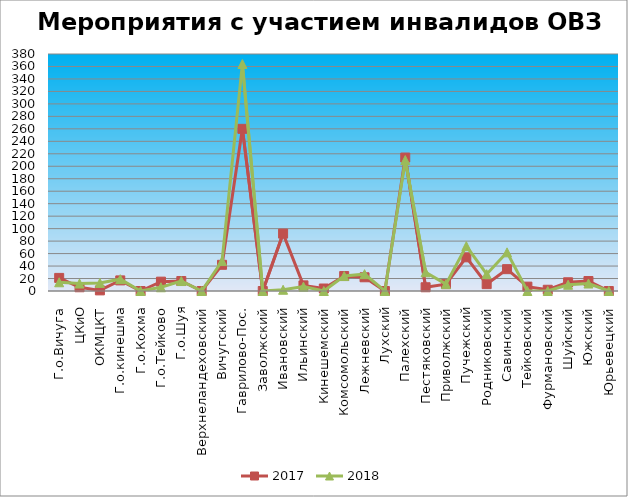
| Category | 2017 | 2018 |
|---|---|---|
| Г.о.Вичуга | 21 | 14 |
| ЦКиО | 6 | 12 |
| ОКМЦКТ | 1 | 13 |
| Г.о.кинешма | 17 | 19 |
| Г.о.Кохма | 0 | 0 |
| Г.о.Тейково | 15 | 6 |
| Г.о.Шуя | 16 | 16 |
| Верхнеландеховский | 0 | 0 |
| Вичугский | 42 | 48 |
| Гаврилово-Пос. | 260 | 364 |
| Заволжский | 0 | 0 |
| Ивановский | 92 | 2 |
| Ильинский | 9 | 7 |
| Кинешемский | 4 | 0 |
| Комсомольский | 24 | 24 |
| Лежневский | 22 | 27 |
| Лухский | 0 | 0 |
| Палехский | 214 | 210 |
| Пестяковский | 6 | 30 |
| Приволжский | 11 | 11 |
| Пучежский | 54 | 72 |
| Родниковский | 11 | 27 |
| Савинский | 35 | 62 |
| Тейковский | 7 | 0 |
| Фурмановский | 2 | 0 |
| Шуйский | 14 | 10 |
| Южский | 16 | 12 |
| Юрьевецкий | 0 | 0 |